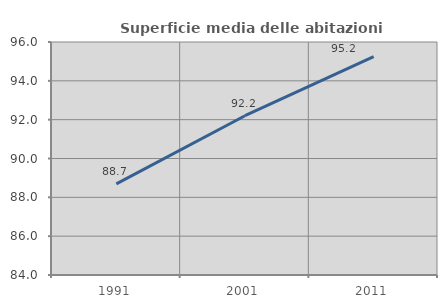
| Category | Superficie media delle abitazioni occupate |
|---|---|
| 1991.0 | 88.693 |
| 2001.0 | 92.204 |
| 2011.0 | 95.248 |